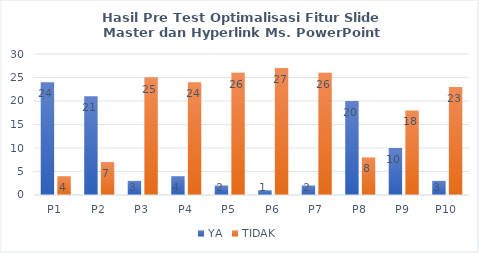
| Category | YA | TIDAK |
|---|---|---|
| P1 | 24 | 4 |
| P2 | 21 | 7 |
| P3 | 3 | 25 |
| P4 | 4 | 24 |
| P5 | 2 | 26 |
| P6 | 1 | 27 |
| P7 | 2 | 26 |
| P8 | 20 | 8 |
| P9 | 10 | 18 |
| P10 | 3 | 23 |